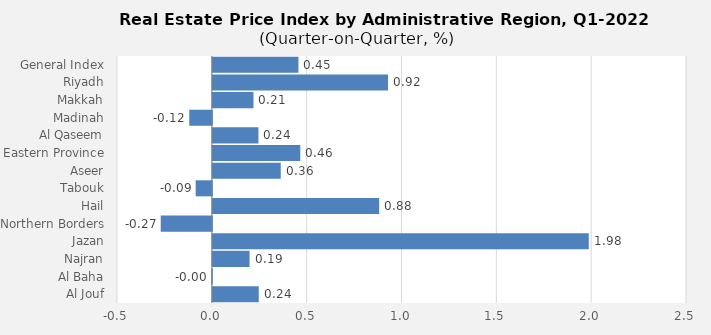
| Category | 2022 |
|---|---|
| General Index | 0.451 |
| Riyadh | 0.924 |
| Makkah | 0.214 |
| Madinah | -0.119 |
| Al Qaseem | 0.24 |
| Eastern Province | 0.461 |
| Aseer | 0.358 |
| Tabouk | -0.085 |
| Hail | 0.877 |
| Northern Borders | -0.269 |
| Jazan | 1.982 |
| Najran | 0.194 |
| Al Baha | -0.003 |
| Al Jouf | 0.242 |